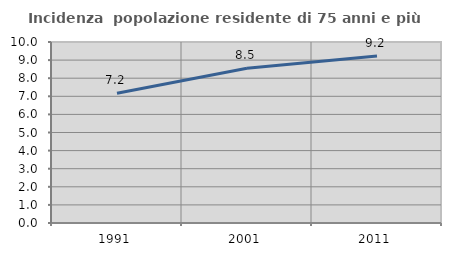
| Category | Incidenza  popolazione residente di 75 anni e più |
|---|---|
| 1991.0 | 7.172 |
| 2001.0 | 8.548 |
| 2011.0 | 9.221 |